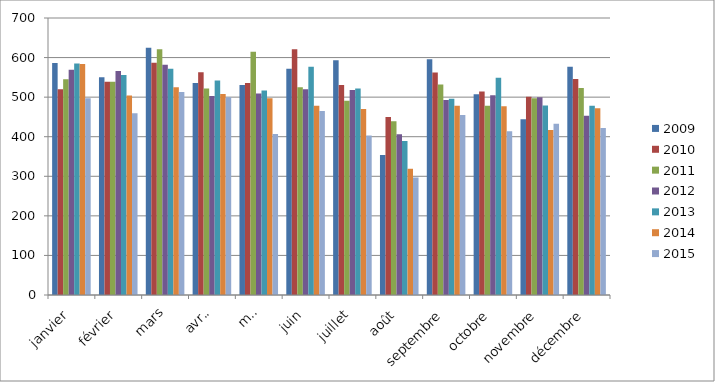
| Category | 2009 | 2010 | 2011 | 2012 | 2013 | 2014 | 2015 |
|---|---|---|---|---|---|---|---|
| janvier | 586 | 520 | 545 | 569 | 585 | 584 | 497 |
| février | 550 | 539 | 539 | 566 | 556 | 504 | 459 |
| mars | 625 | 587 | 621 | 582 | 572 | 525 | 513 |
| avril | 536 | 563 | 522 | 503 | 542 | 508 | 500 |
| mai | 531 | 536 | 615 | 509 | 517 | 497 | 407 |
| juin | 572 | 621 | 525 | 520 | 577 | 478 | 465 |
| juillet | 593 | 531 | 491 | 518 | 522 | 470 | 403 |
| août | 354 | 450 | 439 | 406 | 389 | 319 | 297 |
| septembre | 596 | 562 | 532 | 493 | 496 | 478 | 455 |
| octobre | 507 | 514 | 478 | 505 | 549 | 477 | 414 |
| novembre | 444 | 501 | 497 | 500 | 479 | 417 | 433 |
| décembre | 577 | 546 | 523 | 453 | 478 | 472 | 422 |